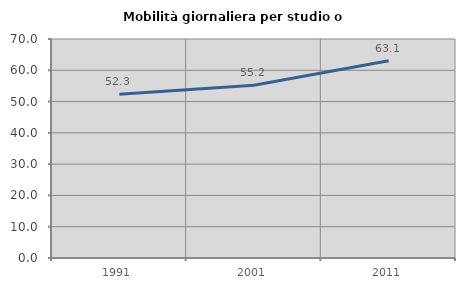
| Category | Mobilità giornaliera per studio o lavoro |
|---|---|
| 1991.0 | 52.328 |
| 2001.0 | 55.246 |
| 2011.0 | 63.076 |